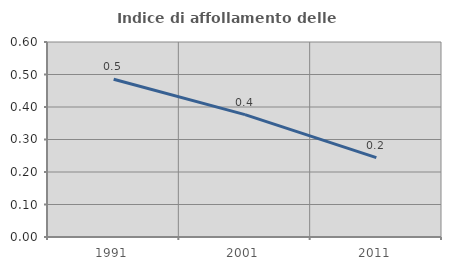
| Category | Indice di affollamento delle abitazioni  |
|---|---|
| 1991.0 | 0.485 |
| 2001.0 | 0.377 |
| 2011.0 | 0.244 |